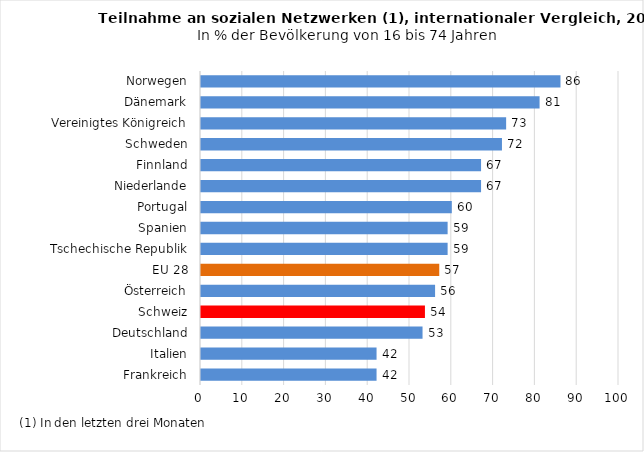
| Category | 2019 |
|---|---|
| Frankreich | 42 |
| Italien | 42 |
| Deutschland | 53 |
| Schweiz | 53.573 |
| Österreich | 56 |
| EU 28 | 57 |
| Tschechische Republik | 59 |
| Spanien | 59 |
| Portugal | 60 |
| Niederlande | 67 |
| Finnland | 67 |
| Schweden | 72 |
| Vereinigtes Königreich | 73 |
| Dänemark | 81 |
| Norwegen | 86 |